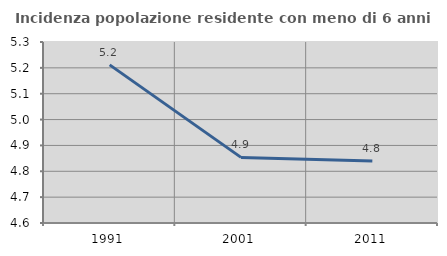
| Category | Incidenza popolazione residente con meno di 6 anni |
|---|---|
| 1991.0 | 5.211 |
| 2001.0 | 4.854 |
| 2011.0 | 4.84 |